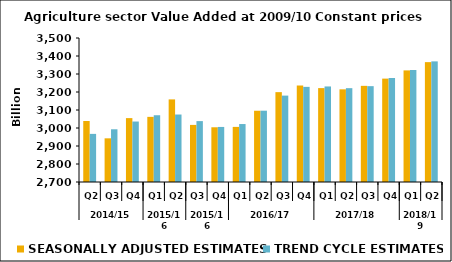
| Category | SEASONALLY ADJUSTED ESTIMATES | TREND CYCLE ESTIMATES |
|---|---|---|
| 0 | 3038.948 | 2967.333 |
| 1 | 2942.628 | 2992.895 |
| 2 | 3054.907 | 3035.95 |
| 3 | 3061.871 | 3070.902 |
| 4 | 3158.909 | 3074.889 |
| 5 | 3017.16 | 3038.315 |
| 6 | 3004.038 | 3005.879 |
| 7 | 3006.116 | 3022.017 |
| 8 | 3095.834 | 3096.156 |
| 9 | 3199.203 | 3179.958 |
| 10 | 3236.041 | 3228.522 |
| 11 | 3221.614 | 3230.808 |
| 12 | 3214.793 | 3221.311 |
| 13 | 3234.174 | 3232.465 |
| 14 | 3274.33 | 3277.771 |
| 15 | 3320.031 | 3322.381 |
| 16 | 3365.916 | 3370.127 |